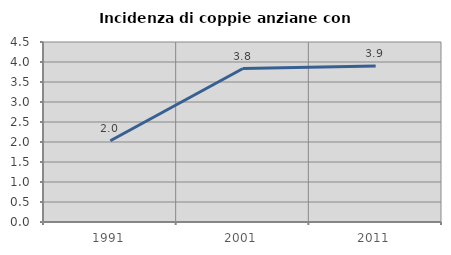
| Category | Incidenza di coppie anziane con figli |
|---|---|
| 1991.0 | 2.03 |
| 2001.0 | 3.837 |
| 2011.0 | 3.899 |